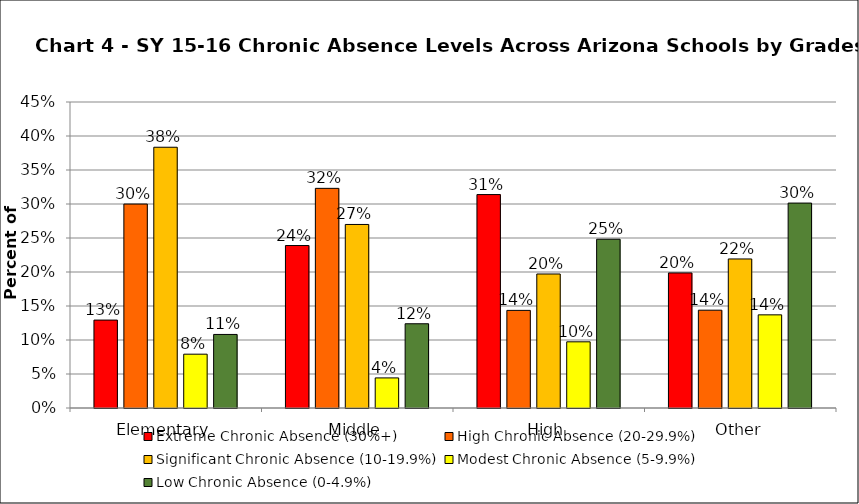
| Category | Extreme Chronic Absence (30%+) | High Chronic Absence (20-29.9%) | Significant Chronic Absence (10-19.9%) | Modest Chronic Absence (5-9.9%) | Low Chronic Absence (0-4.9%) |
|---|---|---|---|---|---|
| 0 | 0.129 | 0.3 | 0.383 | 0.079 | 0.108 |
| 1 | 0.239 | 0.323 | 0.27 | 0.044 | 0.124 |
| 2 | 0.314 | 0.144 | 0.197 | 0.097 | 0.248 |
| 3 | 0.199 | 0.144 | 0.219 | 0.137 | 0.301 |